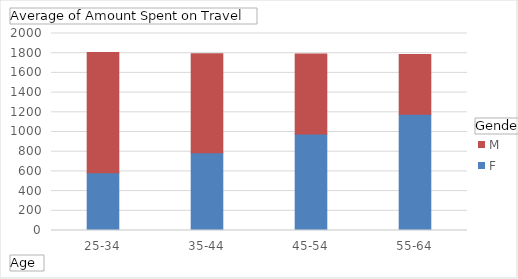
| Category | F | M |
|---|---|---|
| 25-34 | 585.475 | 1221.21 |
| 35-44 | 790.165 | 1004.098 |
| 45-54 | 979.478 | 813.577 |
| 55-64 | 1179.609 | 606.647 |